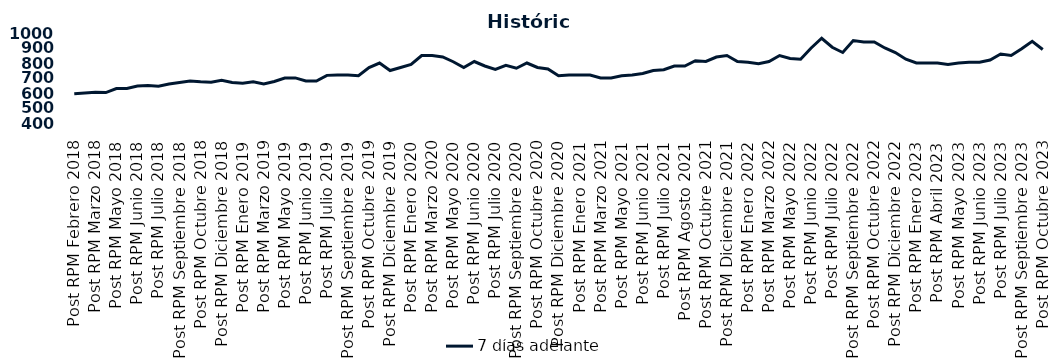
| Category | 7 días adelante  |
|---|---|
| Post RPM Febrero 2018 | 595 |
| Pre RPM Marzo 2018 | 600 |
| Post RPM Marzo 2018 | 605 |
| Pre RPM Mayo 2018 | 603 |
| Post RPM Mayo 2018 | 630 |
| Pre RPM Junio 2018 | 630 |
| Post RPM Junio 2018 | 646.5 |
| Pre RPM Julio 2018 | 650 |
| Post RPM Julio 2018 | 645 |
| Pre RPM Septiembre 2018 | 660 |
| Post RPM Septiembre 2018 | 670 |
| Pre RPM Octubre 2018 | 680 |
| Post RPM Octubre 2018 | 675 |
| Pre RPM Diciembre 2018 | 672.5 |
| Post RPM Diciembre 2018 | 685 |
| Pre RPM Enero 2019 | 670 |
| Post RPM Enero 2019 | 665 |
| Pre RPM Marzo 2019 | 675 |
| Post RPM Marzo 2019 | 661 |
| Pre RPM Mayo 2019 | 677 |
| Post RPM Mayo 2019 | 700 |
| Pre RPM Junio 2019 | 700.5 |
| Post RPM Junio 2019 | 680 |
| Pre RPM Julio 2019 | 680 |
| Post RPM Julio 2019 | 717.5 |
| Pre RPM Septiembre 2019 | 720 |
| Post RPM Septiembre 2019 | 720 |
| Pre RPM Octubre 2019 | 715 |
| Post RPM Octubre 2019 | 770 |
| Pre RPM Diciembre 2019 | 800 |
| Post RPM Diciembre 2019 | 750 |
| Pre RPM Enero 2020 | 770 |
| Post RPM Enero 2020 | 790 |
| Pre RPM Marzo 2020 | 850 |
| Post RPM Marzo 2020 | 850 |
| Pre RPM Mayo 2020 | 840 |
| Post RPM Mayo 2020 | 808.5 |
| Pre RPM Junio 2020 | 770 |
| Post RPM Junio 2020 | 810 |
| Pre RPM Julio 2020 | 780 |
| Post RPM Julio 2020 | 757 |
| Pre RPM Septiembre 2020 | 785 |
| Post RPM Septiembre 2020 | 765 |
| Pre RPM Octubre 2020 | 800 |
| Post RPM Octubre 2020 | 770 |
| Pre RPM Diciembre 2020 | 760 |
| Post RPM Diciembre 2020 | 715 |
| Pre RPM Enero 2021 | 720 |
| Post RPM Enero 2021 | 720 |
| Pre RPM Marzo 2021 | 720 |
| Post RPM Marzo 2021 | 700 |
| Pre RPM Mayo 2021 | 700 |
| Post RPM Mayo 2021 | 715 |
| Pre RPM Junio 2021 | 720 |
| Post RPM Junio 2021 | 730 |
| Pre RPM Julio 2021 | 750 |
| Post RPM Julio 2021 | 755 |
| Pre RPM Agosto 2021 | 780 |
| Post RPM Agosto 2021 | 780 |
| Pre RPM Octubre 2021 | 815 |
| Post RPM Octubre 2021 | 810 |
| Pre RPM Diciembre 2021 | 840 |
| Post RPM Diciembre 2021 | 850 |
| Pre RPM Enero 2022 | 810 |
| Post RPM Enero 2022 | 805 |
| Pre RPM Marzo 2022 | 795 |
| Post RPM Marzo 2022 | 810 |
| Pre RPM Mayo 2022 | 850 |
| Post RPM Mayo 2022 | 830 |
| Pre RPM Junio 2022 | 825 |
| Post RPM Junio 2022 | 900 |
| Pre RPM Julio 2022 | 965 |
| Post RPM Julio 2022 | 905 |
| Pre RPM Septiembre 2022 | 870 |
| Post RPM Septiembre 2022 | 950 |
| Pre RPM Octubre 2022 | 940 |
| Post RPM Octubre 2022 | 940 |
| Pre RPM Diciembre 2022 | 900 |
| Post RPM Diciembre 2022 | 870 |
| Pre RPM Enero 2023 | 825 |
| Post RPM Enero 2023 | 800 |
| Pre RPM Abril 2023 | 800 |
| Post RPM Abril 2023 | 800 |
| Pre RPM Mayo 2023 | 790 |
| Post RPM Mayo 2023 | 800 |
| Pre RPM Junio 2023 | 805 |
| Post RPM Junio 2023 | 805 |
| Pre RPM Julio 2023 | 820 |
| Post RPM Julio 2023 | 860 |
| Pre RPM Septiembre 2023 | 850 |
| Post RPM Septiembre 2023 | 895 |
| Pre RPM Octubre 2023 | 945 |
| Post RPM Octubre 2023 | 890 |